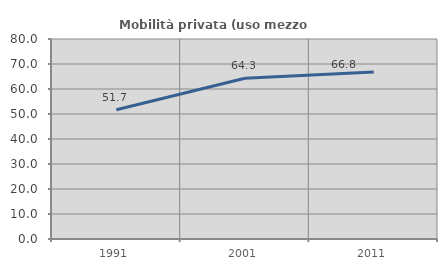
| Category | Mobilità privata (uso mezzo privato) |
|---|---|
| 1991.0 | 51.705 |
| 2001.0 | 64.283 |
| 2011.0 | 66.827 |